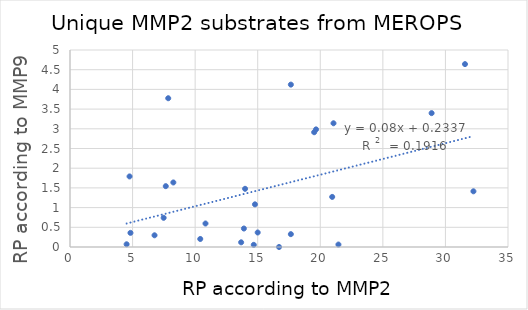
| Category | corresponding MMP9 relative probability (RP) |
|---|---|
| 7.8490824 | 3.776 |
| 14.7798925 | 1.083 |
| 17.6481639 | 0.326 |
| 19.511639 | 2.913 |
| 13.8956964 | 0.469 |
| 4.8324291 | 0.359 |
| 10.4090859 | 0.204 |
| 32.238311 | 1.413 |
| 10.8275618 | 0.596 |
| 31.5630515 | 4.642 |
| 13.9898277 | 1.477 |
| 6.7548904 | 0.297 |
| 4.7582421 | 1.791 |
| 4.5242171 | 0.069 |
| 21.4503759 | 0.062 |
| 16.704852 | 0 |
| 28.8961103 | 3.398 |
| 20.9520793 | 1.271 |
| 17.6490506 | 4.121 |
| 8.25798 | 1.638 |
| 7.653664 | 1.544 |
| 7.4835534 | 0.741 |
| 14.9988557 | 0.368 |
| 19.6600913 | 2.985 |
| 13.6758738 | 0.119 |
| 21.0561673 | 3.141 |
| 14.6847085 | 0.055 |